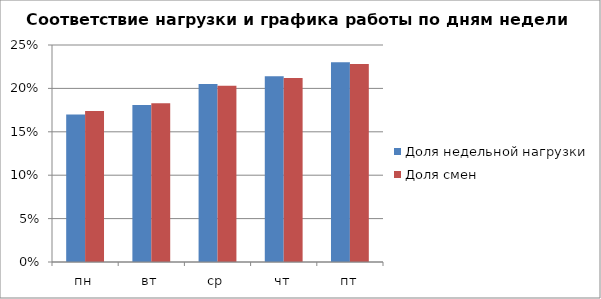
| Category | Доля недельной нагрузки | Доля смен |
|---|---|---|
| пн | 0.17 | 0.174 |
| вт | 0.181 | 0.183 |
| ср | 0.205 | 0.203 |
| чт | 0.214 | 0.212 |
| пт | 0.23 | 0.228 |